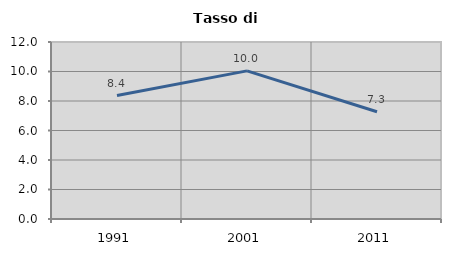
| Category | Tasso di disoccupazione   |
|---|---|
| 1991.0 | 8.368 |
| 2001.0 | 10.041 |
| 2011.0 | 7.269 |